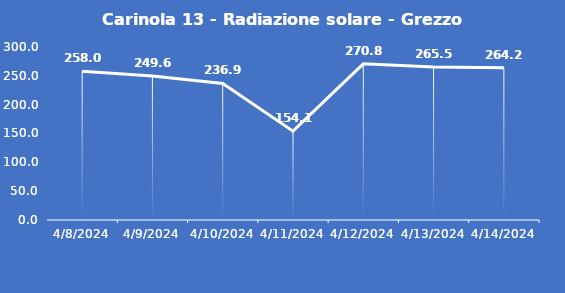
| Category | Carinola 13 - Radiazione solare - Grezzo (W/m2) |
|---|---|
| 4/8/24 | 258 |
| 4/9/24 | 249.6 |
| 4/10/24 | 236.9 |
| 4/11/24 | 154.1 |
| 4/12/24 | 270.8 |
| 4/13/24 | 265.5 |
| 4/14/24 | 264.2 |